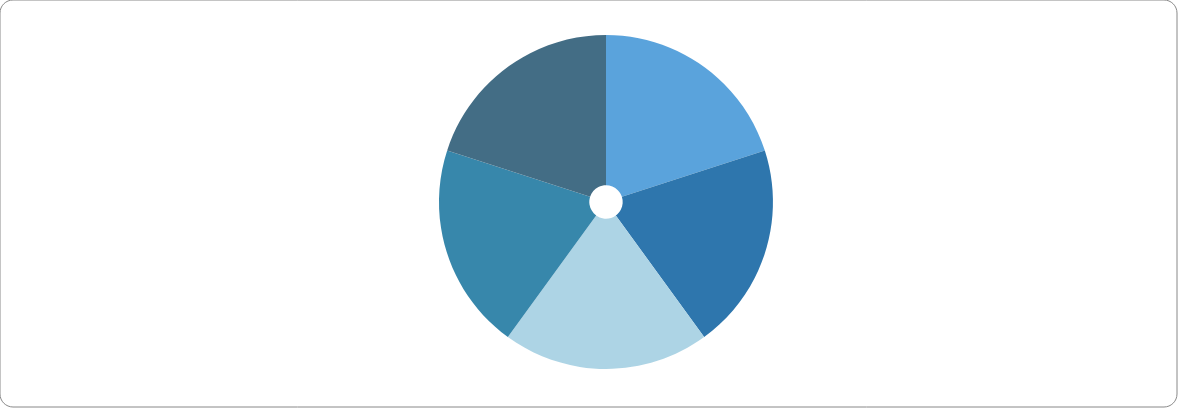
| Category | Series 0 |
|---|---|
| R True | 1 |
| R False | 0 |
| P True | 1 |
| P False | 0 |
| A True | 1 |
| A False | 0 |
| F True | 1 |
| F False | 0 |
| I True | 1 |
| I False | 0 |